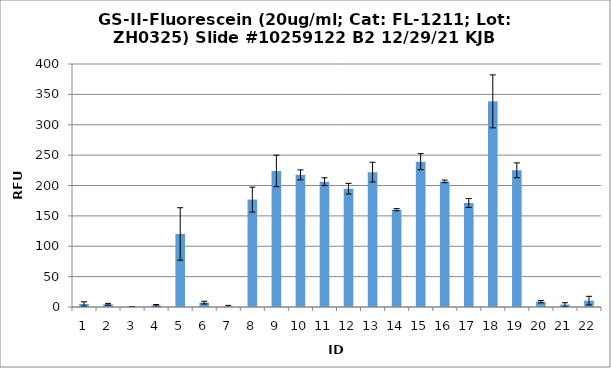
| Category | Series 0 |
|---|---|
| 0 | 5 |
| 1 | 4.5 |
| 2 | 0.25 |
| 3 | 2.75 |
| 4 | 120.25 |
| 5 | 7.25 |
| 6 | 0.75 |
| 7 | 176.75 |
| 8 | 224 |
| 9 | 217.5 |
| 10 | 206.25 |
| 11 | 194.75 |
| 12 | 222 |
| 13 | 160.25 |
| 14 | 239.25 |
| 15 | 206.75 |
| 16 | 171.25 |
| 17 | 338.5 |
| 18 | 225 |
| 19 | 8.75 |
| 20 | 4 |
| 21 | 10.5 |